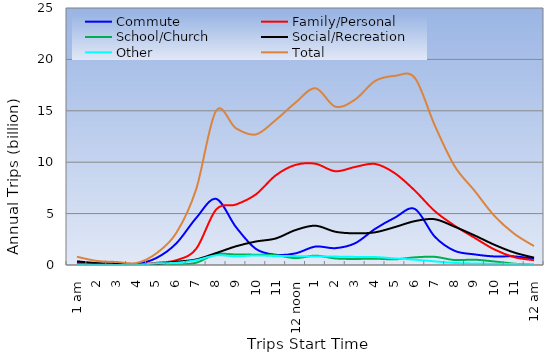
| Category | Commute  | Family/Personal | School/Church | Social/Recreation | Other | Total |
|---|---|---|---|---|---|---|
| 1 am | 0.246 | 0.16 | 0.012 | 0.356 | 0.027 | 0.801 |
| 2 | 0.132 | 0.062 | 0.001 | 0.18 | 0.022 | 0.396 |
| 3 | 0.151 | 0.02 | 0.002 | 0.11 | 0.01 | 0.293 |
| 4 | 0.115 | 0.043 | 0 | 0.031 | 0.005 | 0.195 |
| 5 | 0.683 | 0.211 | 0.008 | 0.075 | 0.16 | 1.137 |
| 6 | 2.103 | 0.466 | 0.03 | 0.314 | 0.209 | 3.121 |
| 7 | 4.574 | 1.573 | 0.22 | 0.54 | 0.471 | 7.379 |
| 8 | 6.434 | 5.39 | 1.046 | 1.157 | 0.937 | 15 |
| 9 | 3.694 | 5.88 | 1.022 | 1.818 | 0.845 | 13.3 |
| 10 | 1.571 | 6.862 | 1.005 | 2.285 | 0.935 | 12.7 |
| 11 | 0.995 | 8.717 | 0.962 | 2.58 | 0.878 | 14.1 |
| 12 noon | 1.131 | 9.74 | 0.668 | 3.401 | 0.865 | 15.8 |
| 1 | 1.794 | 9.85 | 0.909 | 3.822 | 0.82 | 17.2 |
| 2 | 1.638 | 9.121 | 0.638 | 3.234 | 0.819 | 15.4 |
| 3 | 2.119 | 9.541 | 0.59 | 3.079 | 0.789 | 16.1 |
| 4 | 3.511 | 9.832 | 0.616 | 3.18 | 0.774 | 17.9 |
| 5 | 4.609 | 8.922 | 0.553 | 3.69 | 0.64 | 18.4 |
| 6 | 5.454 | 7.239 | 0.744 | 4.268 | 0.517 | 18.2 |
| 7 | 2.763 | 5.25 | 0.795 | 4.455 | 0.354 | 13.6 |
| 8 | 1.384 | 3.829 | 0.484 | 3.727 | 0.202 | 9.624 |
| 9 | 1.033 | 2.652 | 0.517 | 2.886 | 0.148 | 7.237 |
| 10 | 0.832 | 1.514 | 0.342 | 1.971 | 0.126 | 4.785 |
| 11 | 0.838 | 0.764 | 0.13 | 1.215 | 0.095 | 3.042 |
| 12 am | 0.606 | 0.465 | 0.016 | 0.713 | 0.039 | 1.838 |